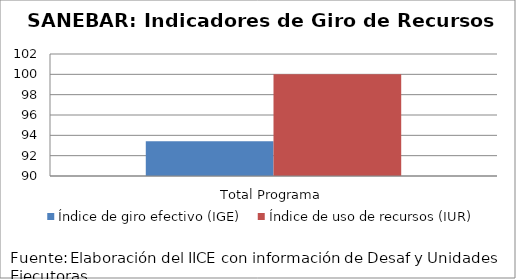
| Category | Índice de giro efectivo (IGE) | Índice de uso de recursos (IUR)  |
|---|---|---|
| Total Programa | 93.428 | 100 |